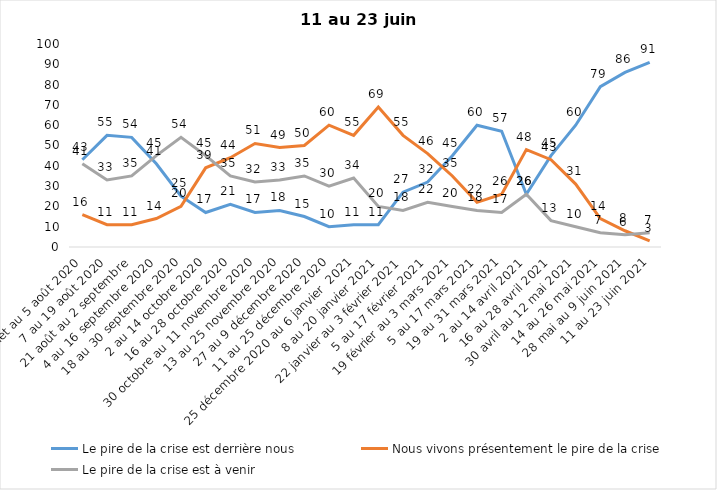
| Category | Le pire de la crise est derrière nous | Nous vivons présentement le pire de la crise | Le pire de la crise est à venir |
|---|---|---|---|
| 24 juillet au 5 août 2020 | 43 | 16 | 41 |
| 7 au 19 août 2020 | 55 | 11 | 33 |
| 21 août au 2 septembre | 54 | 11 | 35 |
| 4 au 16 septembre 2020 | 41 | 14 | 45 |
| 18 au 30 septembre 2020 | 25 | 20 | 54 |
| 2 au 14 octobre 2020 | 17 | 39 | 45 |
| 16 au 28 octobre 2020 | 21 | 44 | 35 |
| 30 octobre au 11 novembre 2020 | 17 | 51 | 32 |
| 13 au 25 novembre 2020 | 18 | 49 | 33 |
| 27 au 9 décembre 2020 | 15 | 50 | 35 |
| 11 au 25 décembre 2020 | 10 | 60 | 30 |
| 25 décembre 2020 au 6 janvier  2021 | 11 | 55 | 34 |
| 8 au 20 janvier 2021 | 11 | 69 | 20 |
| 22 janvier au 3 février 2021 | 27 | 55 | 18 |
| 5 au 17 février 2021 | 32 | 46 | 22 |
| 19 février au 3 mars 2021 | 45 | 35 | 20 |
| 5 au 17 mars 2021 | 60 | 22 | 18 |
| 19 au 31 mars 2021 | 57 | 26 | 17 |
| 2 au 14 avril 2021 | 26 | 48 | 26 |
| 16 au 28 avril 2021 | 45 | 43 | 13 |
| 30 avril au 12 mai 2021 | 60 | 31 | 10 |
| 14 au 26 mai 2021 | 79 | 14 | 7 |
| 28 mai au 9 juin 2021 | 86 | 8 | 6 |
| 11 au 23 juin 2021 | 91 | 3 | 7 |